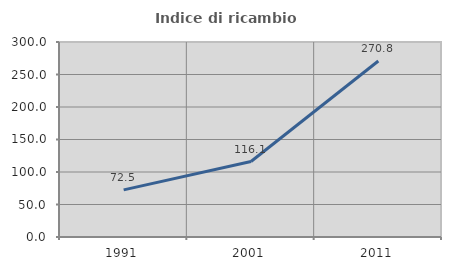
| Category | Indice di ricambio occupazionale  |
|---|---|
| 1991.0 | 72.496 |
| 2001.0 | 116.114 |
| 2011.0 | 270.814 |